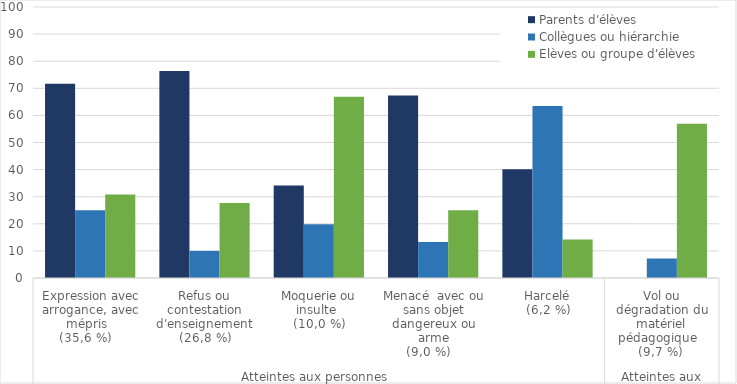
| Category | Parents d'élèves  | Collègues ou hiérarchie | Elèves ou groupe d'élèves |
|---|---|---|---|
| 0 | 71.7 | 25 | 30.8 |
| 1 | 76.4 | 10 | 27.7 |
| 2 | 34.1 | 19.8 | 66.9 |
| 3 | 67.3 | 13.3 | 25 |
| 4 | 40.1 | 63.5 | 14.2 |
| 5 | 0 | 7.2 | 56.9 |